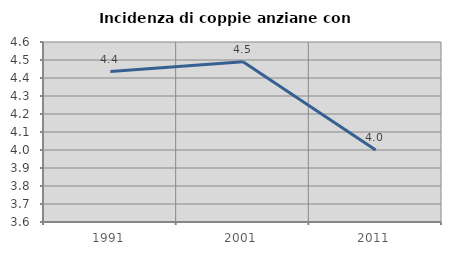
| Category | Incidenza di coppie anziane con figli |
|---|---|
| 1991.0 | 4.435 |
| 2001.0 | 4.49 |
| 2011.0 | 4 |